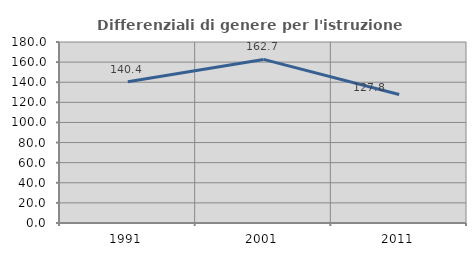
| Category | Differenziali di genere per l'istruzione superiore |
|---|---|
| 1991.0 | 140.379 |
| 2001.0 | 162.683 |
| 2011.0 | 127.778 |